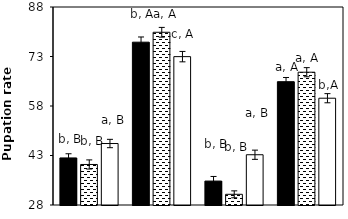
| Category | AB | AC | CK |
|---|---|---|---|
| aCO2-Bt | 42.26 | 40.28 | 46.63 |
| aCO2-Xy | 77.34 | 80.34 | 72.96 |
| eCO2-Bt | 35.25 | 31.24 | 43.23 |
| eCO2-Xy | 65.37 | 68.24 | 60.36 |